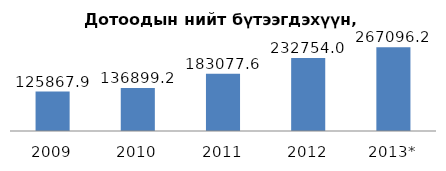
| Category | Дотоодын нийт бүтээгдэхүүн  |
|---|---|
| 2009 | 125867.9 |
| 2010 | 136899.2 |
| 2011 | 183077.6 |
| 2012 | 232754 |
| 2013* | 267096.2 |